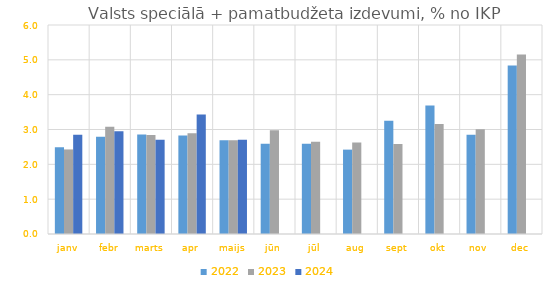
| Category | 2022 | 2023 | 2024 |
|---|---|---|---|
| janv | 2.487 | 2.428 | 2.85 |
| febr | 2.789 | 3.078 | 2.947 |
| marts | 2.856 | 2.845 | 2.704 |
| apr | 2.827 | 2.889 | 3.433 |
| maijs | 2.689 | 2.693 | 2.705 |
| jūn | 2.59 | 2.975 | 0 |
| jūl | 2.592 | 2.65 | 0 |
| aug | 2.422 | 2.625 | 0 |
| sept | 3.25 | 2.583 | 0 |
| okt | 3.688 | 3.159 | 0 |
| nov | 2.847 | 3.01 | 0 |
| dec | 4.838 | 5.152 | 0 |